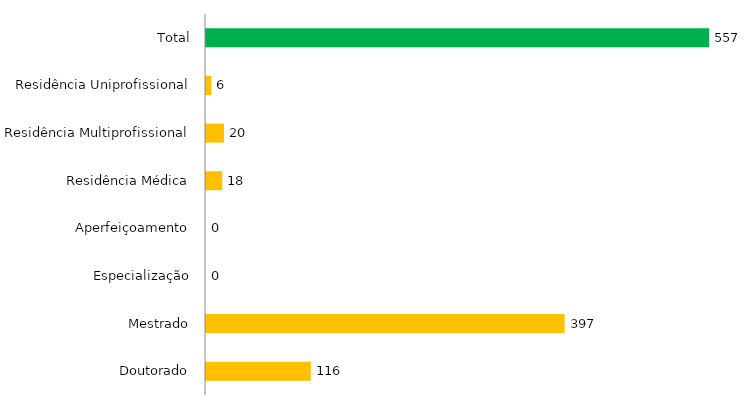
| Category | Pós - Graduação UFGD |
|---|---|
| Doutorado | 116 |
| Mestrado | 397 |
| Especialização | 0 |
| Aperfeiçoamento | 0 |
| Residência Médica | 18 |
| Residência Multiprofissional | 20 |
| Residência Uniprofissional | 6 |
| Total | 557 |